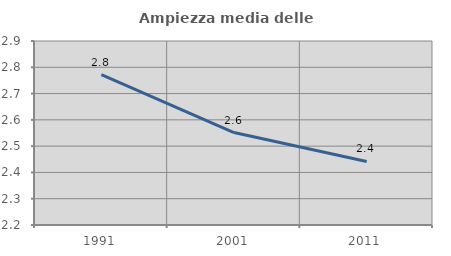
| Category | Ampiezza media delle famiglie |
|---|---|
| 1991.0 | 2.773 |
| 2001.0 | 2.552 |
| 2011.0 | 2.442 |